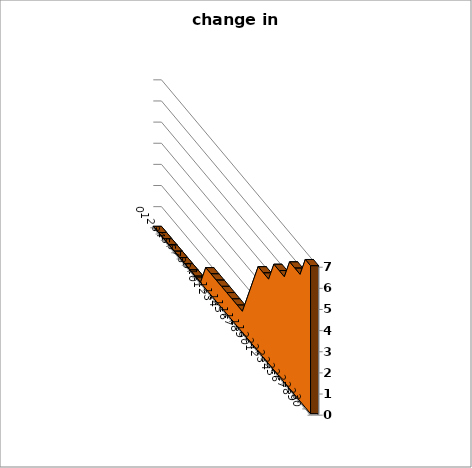
| Category | change in continent |
|---|---|
| 0.0 | 0 |
| 1.0 | 0 |
| 2.0 | 0 |
| 3.0 | 0 |
| 4.0 | 0 |
| 5.0 | 0 |
| 6.0 | 0 |
| 7.0 | 0 |
| 8.0 | 0 |
| 9.0 | 0 |
| 10.0 | 1 |
| 11.0 | 1 |
| 12.0 | 1 |
| 13.0 | 1 |
| 14.0 | 1 |
| 15.0 | 1 |
| 16.0 | 1 |
| 17.0 | 1 |
| 18.0 | 2 |
| 19.0 | 3 |
| 20.0 | 4 |
| 21.0 | 4 |
| 22.0 | 4 |
| 23.0 | 5 |
| 24.0 | 5 |
| 25.0 | 5 |
| 26.0 | 6 |
| 27.0 | 6 |
| 28.0 | 6 |
| 29.0 | 7 |
| 30.0 | 7 |